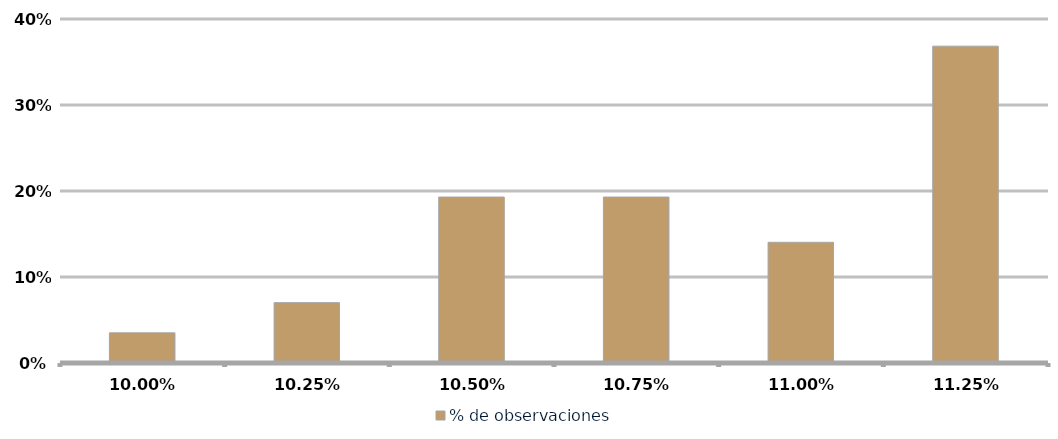
| Category | % de observaciones  |
|---|---|
| 0.09999999999999999 | 0.035 |
| 0.1025 | 0.07 |
| 0.105 | 0.193 |
| 0.1075 | 0.193 |
| 0.11 | 0.14 |
| 0.1125 | 0.368 |